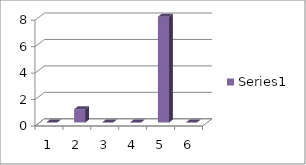
| Category | Series 0 |
|---|---|
| 0 | 0 |
| 1 | 1 |
| 2 | 0 |
| 3 | 0 |
| 4 | 8 |
| 5 | 0 |